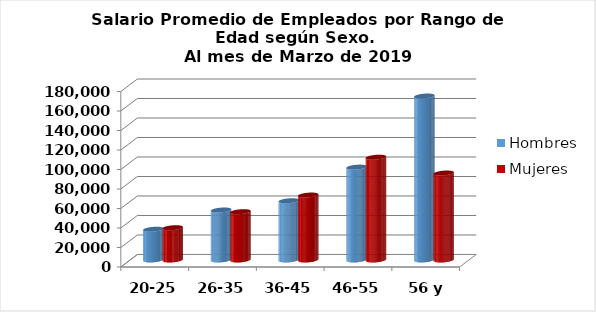
| Category | Hombres | Mujeres |
|---|---|---|
| 20-25 | 31577.75 | 33127.529 |
| 26-35 | 51283.635 | 49563.045 |
| 36-45 | 60789.55 | 66615.286 |
| 46-55 | 95279.874 | 105446.677 |
| 56 y más | 168197.937 | 89187.975 |